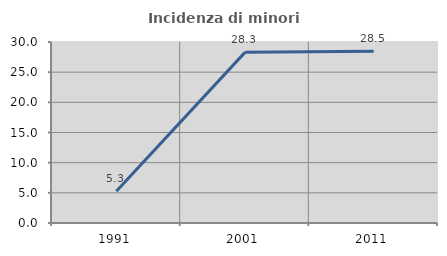
| Category | Incidenza di minori stranieri |
|---|---|
| 1991.0 | 5.263 |
| 2001.0 | 28.283 |
| 2011.0 | 28.48 |